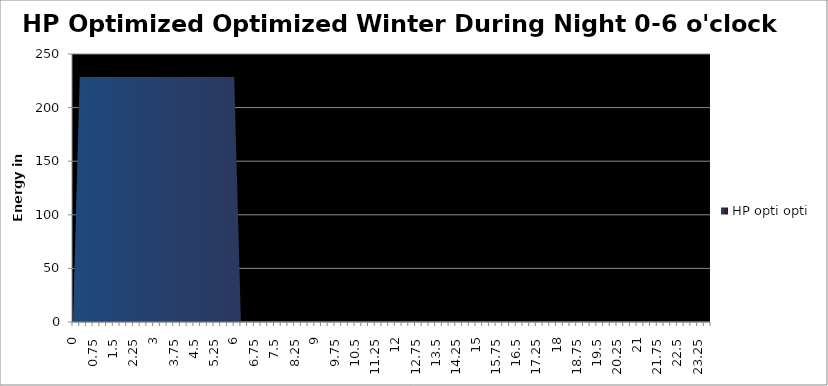
| Category | HP opti opti |
|---|---|
| 0.0 | 0 |
| 0.25 | 228.495 |
| 0.5 | 228.495 |
| 0.75 | 228.495 |
| 1.0 | 228.495 |
| 1.25 | 228.495 |
| 1.5 | 228.495 |
| 1.75 | 228.495 |
| 2.0 | 228.495 |
| 2.25 | 228.495 |
| 2.5 | 228.495 |
| 2.75 | 228.495 |
| 3.0 | 228.495 |
| 3.25 | 228.495 |
| 3.5 | 228.495 |
| 3.75 | 228.495 |
| 4.0 | 228.495 |
| 4.25 | 228.495 |
| 4.5 | 228.495 |
| 4.75 | 228.495 |
| 5.0 | 228.495 |
| 5.25 | 228.495 |
| 5.5 | 228.495 |
| 5.75 | 228.495 |
| 6.0 | 228.495 |
| 6.25 | 0 |
| 6.5 | 0 |
| 6.75 | 0 |
| 7.0 | 0 |
| 7.25 | 0 |
| 7.5 | 0 |
| 7.75 | 0 |
| 8.0 | 0 |
| 8.25 | 0 |
| 8.5 | 0 |
| 8.75 | 0 |
| 9.0 | 0 |
| 9.25 | 0 |
| 9.5 | 0 |
| 9.75 | 0 |
| 10.0 | 0 |
| 10.25 | 0 |
| 10.5 | 0 |
| 10.75 | 0 |
| 11.0 | 0 |
| 11.25 | 0 |
| 11.5 | 0 |
| 11.75 | 0 |
| 12.0 | 0 |
| 12.25 | 0 |
| 12.5 | 0 |
| 12.75 | 0 |
| 13.0 | 0 |
| 13.25 | 0 |
| 13.5 | 0 |
| 13.75 | 0 |
| 14.0 | 0 |
| 14.25 | 0 |
| 14.5 | 0 |
| 14.75 | 0 |
| 15.0 | 0 |
| 15.25 | 0 |
| 15.5 | 0 |
| 15.75 | 0 |
| 16.0 | 0 |
| 16.25 | 0 |
| 16.5 | 0 |
| 16.75 | 0 |
| 17.0 | 0 |
| 17.25 | 0 |
| 17.5 | 0 |
| 17.75 | 0 |
| 18.0 | 0 |
| 18.25 | 0 |
| 18.5 | 0 |
| 18.75 | 0 |
| 19.0 | 0 |
| 19.25 | 0 |
| 19.5 | 0 |
| 19.75 | 0 |
| 20.0 | 0 |
| 20.25 | 0 |
| 20.5 | 0 |
| 20.75 | 0 |
| 21.0 | 0 |
| 21.25 | 0 |
| 21.5 | 0 |
| 21.75 | 0 |
| 22.0 | 0 |
| 22.25 | 0 |
| 22.5 | 0 |
| 22.75 | 0 |
| 23.0 | 0 |
| 23.25 | 0 |
| 23.5 | 0 |
| 23.75 | 0 |